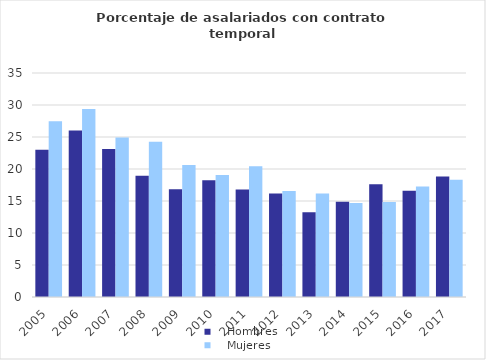
| Category |    Hombres |    Mujeres |
|---|---|---|
| 2005.0 | 22.99 | 27.445 |
| 2006.0 | 26.035 | 29.372 |
| 2007.0 | 23.139 | 24.91 |
| 2008.0 | 18.948 | 24.274 |
| 2009.0 | 16.836 | 20.607 |
| 2010.0 | 18.232 | 19.066 |
| 2011.0 | 16.813 | 20.417 |
| 2012.0 | 16.154 | 16.57 |
| 2013.0 | 13.252 | 16.163 |
| 2014.0 | 14.888 | 14.677 |
| 2015.0 | 17.633 | 14.842 |
| 2016.0 | 16.587 | 17.276 |
| 2017.0 | 18.814 | 18.332 |